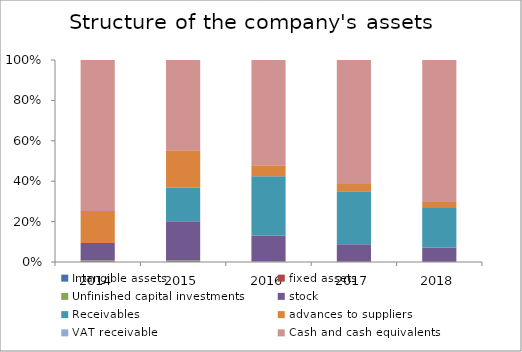
| Category | Intangible assets | fixed assets | Unfinished capital investments | stock | Receivables | advances to suppliers | VAT receivable | Cash and cash equivalents |
|---|---|---|---|---|---|---|---|---|
| 2014.0 | 0 | 0 | 0.007 | 0.087 | 0 | 0.158 | 0 | 0.747 |
| 2015.0 | 0 | 0 | 0.008 | 0.194 | 0.166 | 0.185 | 0 | 0.447 |
| 2016.0 | 0 | 0.001 | 0.003 | 0.127 | 0.294 | 0.054 | 0 | 0.521 |
| 2017.0 | 0 | 0.002 | 0 | 0.085 | 0.262 | 0.036 | 0 | 0.614 |
| 2018.0 | 0 | 0.001 | 0 | 0.07 | 0.196 | 0.029 | 0 | 0.703 |